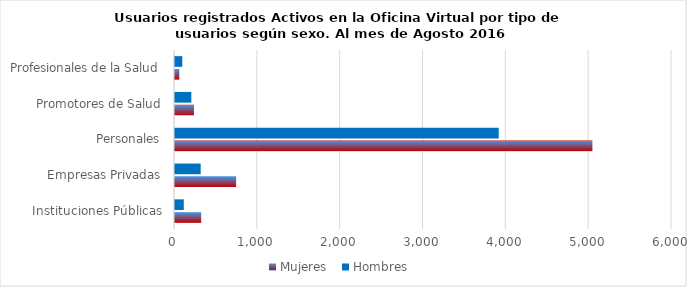
| Category | Mujeres | Hombres |
|---|---|---|
| Instituciones Públicas | 316 | 106 |
| Empresas Privadas | 738 | 310 |
| Personales | 5039 | 3908 |
| Promotores de Salud | 229 | 197 |
| Profesionales de la Salud | 52 | 88 |